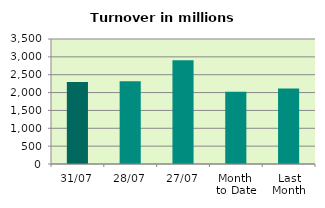
| Category | Series 0 |
|---|---|
| 31/07 | 2297.289 |
| 28/07 | 2316.774 |
| 27/07 | 2907.491 |
| Month 
to Date | 2019.592 |
| Last
Month | 2115.436 |